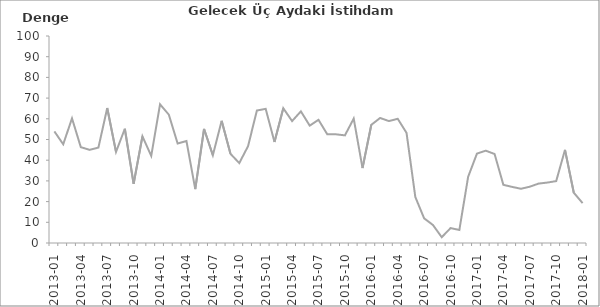
| Category | Denge  |
|---|---|
| 2013-01 | 53.9 |
|  | 47.7 |
|  | 60.2 |
| 2013-04 | 46.3 |
|  | 45 |
|  | 46.1 |
| 2013-07 | 65.2 |
|  | 44 |
|  | 55.2 |
| 2013-10 | 28.6 |
|  | 51.5 |
|  | 42.1 |
| 2014-01 | 67 |
|  | 62 |
|  | 48.1 |
| 2014-04 | 49.3 |
|  | 26 |
|  | 55.1 |
| 2014-07 | 42.4 |
|  | 59 |
|  | 43.1 |
| 2014-10 | 38.6 |
|  | 46.8 |
|  | 64 |
| 2015-01 | 64.8 |
|  | 48.8 |
|  | 65.1 |
| 2015-04 | 58.9 |
|  | 63.6 |
|  | 56.7 |
| 2015-07 | 59.5 |
|  | 52.5 |
|  | 52.5 |
| 2015-10 | 52 |
|  | 60.1 |
|  | 36.2 |
| 2016-01 | 57.1 |
|  | 60.4 |
|  | 58.9 |
| 2016-04 | 60 |
|  | 53.2 |
|  | 22.2 |
| 2016-07 | 11.9 |
|  | 8.7 |
|  | 2.8 |
| 2016-10 | 7.2 |
|  | 6.3 |
|  | 32 |
| 2017-01 | 43.2 |
|  | 44.6 |
|  | 43 |
| 2017-04 | 28.1 |
|  | 27.1 |
|  | 26.2 |
| 2017-07 | 27.2 |
|  | 28.7 |
|  | 29.2 |
| 2017-10 | 29.9 |
|  | 45 |
|  | 24.3 |
| 2018-01 | 19.3 |